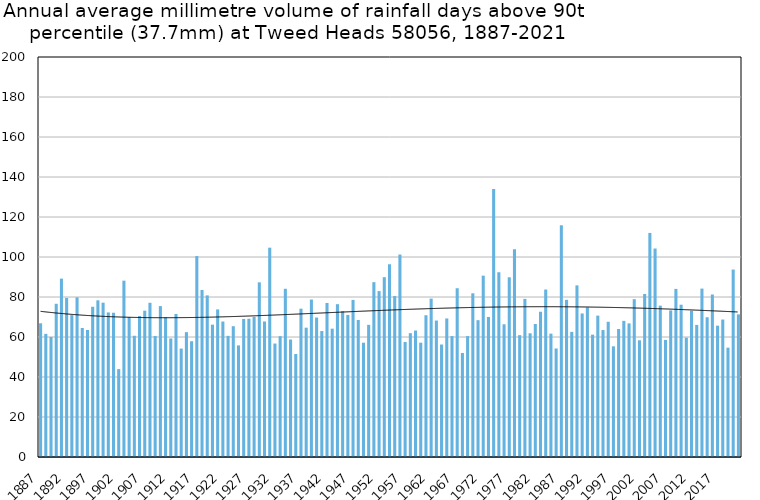
| Category | Annual average mm in days above 90th percentile |
|---|---|
| 1887 | 66.854 |
| 1888 | 61.571 |
| 1889 | 60.038 |
| 1890 | 76.606 |
| 1891 | 89.183 |
| 1892 | 79.555 |
| 1893 | 70.954 |
| 1894 | 79.829 |
| 1895 | 64.51 |
| 1896 | 63.5 |
| 1897 | 75.112 |
| 1898 | 78.331 |
| 1899 | 77.17 |
| 1900 | 72.292 |
| 1901 | 72.1 |
| 1902 | 43.95 |
| 1903 | 88.167 |
| 1904 | 69.961 |
| 1905 | 60.617 |
| 1906 | 70.485 |
| 1907 | 73.155 |
| 1908 | 77.1 |
| 1909 | 60.525 |
| 1910 | 75.455 |
| 1911 | 69.888 |
| 1912 | 59.262 |
| 1913 | 71.531 |
| 1914 | 54.215 |
| 1915 | 62.425 |
| 1916 | 57.88 |
| 1917 | 100.475 |
| 1918 | 83.52 |
| 1919 | 80.814 |
| 1920 | 66.173 |
| 1921 | 73.795 |
| 1922 | 67.743 |
| 1923 | 60.575 |
| 1924 | 65.4 |
| 1925 | 55.806 |
| 1926 | 69.04 |
| 1927 | 69.125 |
| 1928 | 70.06 |
| 1929 | 87.33 |
| 1930 | 67.773 |
| 1931 | 104.658 |
| 1932 | 56.733 |
| 1933 | 60.41 |
| 1934 | 84.113 |
| 1935 | 58.733 |
| 1936 | 51.5 |
| 1937 | 74.171 |
| 1938 | 64.667 |
| 1939 | 78.73 |
| 1940 | 69.725 |
| 1941 | 62.98 |
| 1942 | 77.025 |
| 1943 | 64.164 |
| 1944 | 76.412 |
| 1945 | 72.938 |
| 1946 | 71.027 |
| 1947 | 78.546 |
| 1948 | 68.507 |
| 1949 | 57.14 |
| 1950 | 66.073 |
| 1951 | 87.42 |
| 1952 | 82.944 |
| 1953 | 89.912 |
| 1954 | 96.341 |
| 1955 | 80.475 |
| 1956 | 101.238 |
| 1957 | 57.5 |
| 1958 | 61.922 |
| 1959 | 63.236 |
| 1960 | 57.167 |
| 1961 | 70.882 |
| 1962 | 79.185 |
| 1963 | 68.235 |
| 1964 | 56.24 |
| 1965 | 69.267 |
| 1966 | 60.458 |
| 1967 | 84.383 |
| 1968 | 52 |
| 1969 | 60.442 |
| 1970 | 81.85 |
| 1971 | 68.412 |
| 1972 | 90.668 |
| 1973 | 70.031 |
| 1974 | 133.944 |
| 1975 | 92.378 |
| 1976 | 66.356 |
| 1977 | 89.857 |
| 1978 | 103.873 |
| 1979 | 60.92 |
| 1980 | 79.075 |
| 1981 | 61.85 |
| 1982 | 66.5 |
| 1983 | 72.612 |
| 1984 | 83.74 |
| 1985 | 61.688 |
| 1986 | 54.267 |
| 1987 | 115.867 |
| 1988 | 78.565 |
| 1989 | 62.567 |
| 1990 | 85.815 |
| 1991 | 71.767 |
| 1992 | 74.8 |
| 1993 | 61.167 |
| 1994 | 70.691 |
| 1995 | 63.475 |
| 1996 | 67.622 |
| 1997 | 55.325 |
| 1998 | 64 |
| 1999 | 68.071 |
| 2000 | 66.8 |
| 2001 | 78.911 |
| 2002 | 58.356 |
| 2003 | 81.492 |
| 2004 | 112.036 |
| 2005 | 104.24 |
| 2006 | 75.68 |
| 2007 | 58.533 |
| 2008 | 73.292 |
| 2009 | 84.046 |
| 2010 | 76.15 |
| 2011 | 59.683 |
| 2012 | 73.114 |
| 2013 | 66.04 |
| 2014 | 84.2 |
| 2015 | 69.878 |
| 2016 | 81.255 |
| 2017 | 65.675 |
| 2018 | 68.733 |
| 2019 | 54.667 |
| 2020 | 93.73 |
| 2021 | 71.307 |